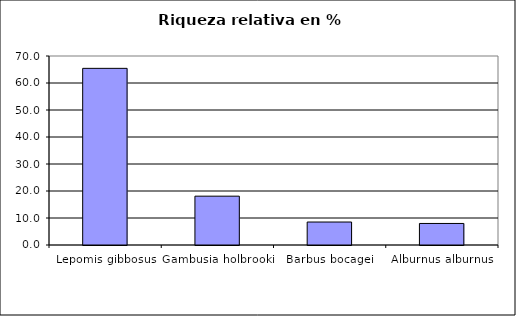
| Category | Series 0 |
|---|---|
| Lepomis gibbosus | 65.426 |
| Gambusia holbrooki | 18.085 |
| Barbus bocagei | 8.511 |
| Alburnus alburnus | 7.979 |